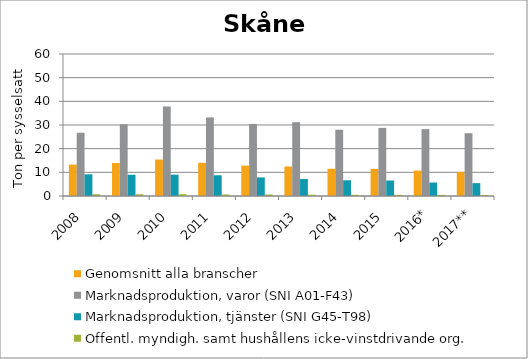
| Category | Genomsnitt alla branscher | Marknadsproduktion, varor (SNI A01-F43) | Marknadsproduktion, tjänster (SNI G45-T98) | Offentl. myndigh. samt hushållens icke-vinstdrivande org. |
|---|---|---|---|---|
| 2008 | 13.27 | 26.737 | 9.16 | 0.736 |
| 2009 | 13.934 | 30.343 | 8.981 | 0.742 |
| 2010 | 15.421 | 37.838 | 8.998 | 0.752 |
| 2011 | 14.02 | 33.201 | 8.765 | 0.643 |
| 2012 | 12.845 | 30.459 | 7.843 | 0.644 |
| 2013 | 12.464 | 31.191 | 7.183 | 0.549 |
| 2014 | 11.514 | 27.999 | 6.647 | 0.51 |
| 2015 | 11.459 | 28.779 | 6.546 | 0.476 |
| 2016* | 10.721 | 28.262 | 5.695 | 0.46 |
| 2017** | 10.2 | 26.529 | 5.434 | 0.429 |